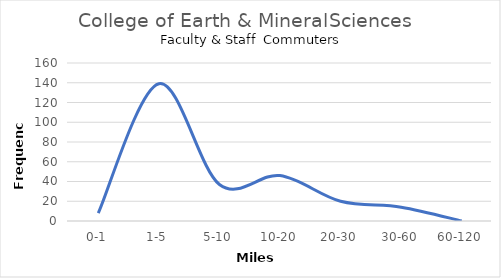
| Category | Frequency |
|---|---|
| 0-1 | 8 |
| 1-5 | 139 |
| 5-10 | 37 |
| 10-20 | 46 |
| 20-30 | 20 |
| 30-60 | 14 |
| 60-120 | 0 |